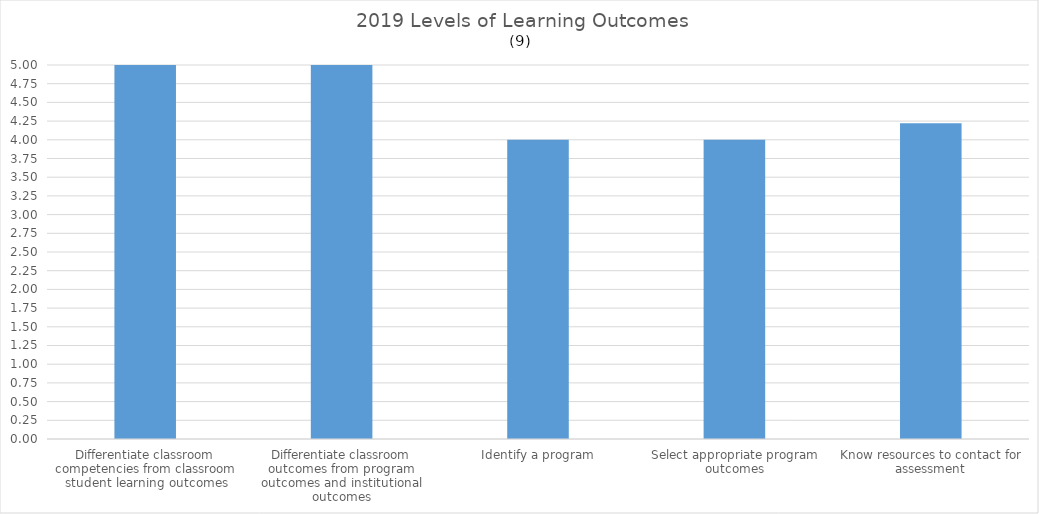
| Category | Series 0 |
|---|---|
| Differentiate classroom competencies from classroom student learning outcomes | 5 |
| Differentiate classroom outcomes from program outcomes and institutional outcomes | 5 |
| Identify a program | 4 |
| Select appropriate program outcomes | 4 |
| Know resources to contact for assessment | 4.22 |